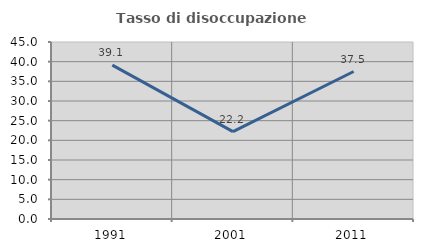
| Category | Tasso di disoccupazione giovanile  |
|---|---|
| 1991.0 | 39.13 |
| 2001.0 | 22.222 |
| 2011.0 | 37.5 |